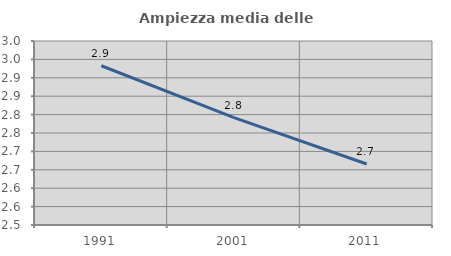
| Category | Ampiezza media delle famiglie |
|---|---|
| 1991.0 | 2.933 |
| 2001.0 | 2.792 |
| 2011.0 | 2.666 |